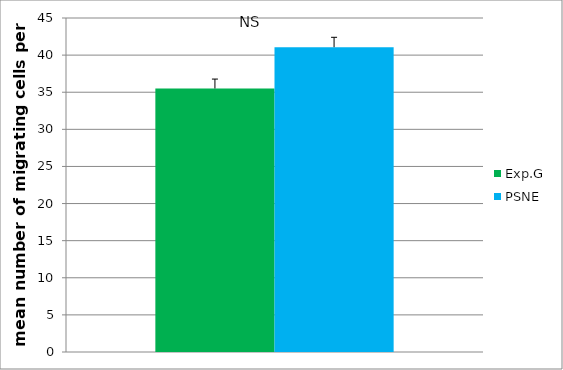
| Category | Exp.G | PSNE |
|---|---|---|
| 0 | 35.5 | 41.067 |